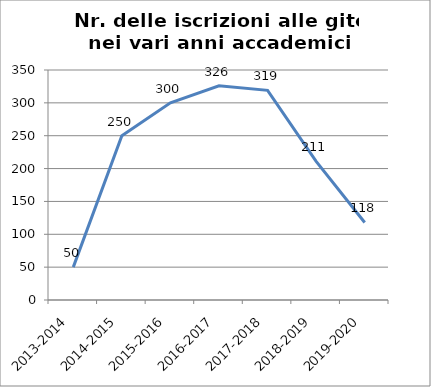
| Category | Nr. Iscrizioni alle Gite |
|---|---|
| 2013-2014 | 50 |
| 2014-2015 | 250 |
| 2015-2016 | 300 |
| 2016-2017 | 326 |
| 2017-2018 | 319 |
| 2018-2019 | 211 |
| 2019-2020 | 118 |